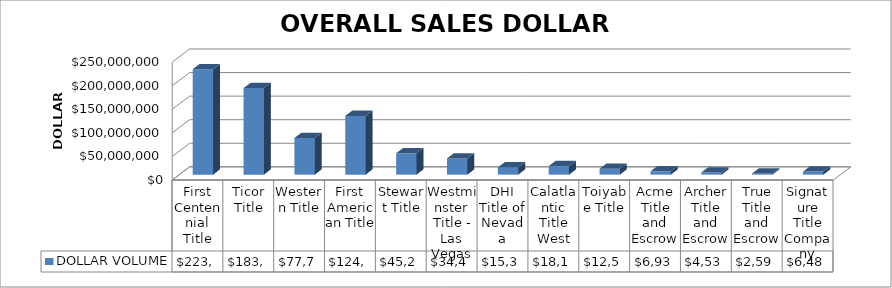
| Category | DOLLAR VOLUME |
|---|---|
| First Centennial Title | 223700445 |
| Ticor Title | 183575388 |
| Western Title | 77753390 |
| First American Title | 124658081.86 |
| Stewart Title | 45248414 |
| Westminster Title - Las Vegas | 34449098 |
| DHI Title of Nevada | 15389690 |
| Calatlantic Title West | 18120717 |
| Toiyabe Title | 12544900 |
| Acme Title and Escrow | 6937000 |
| Archer Title and Escrow | 4534000 |
| True Title and Escrow | 2594000 |
| Signature Title Company | 6485000 |